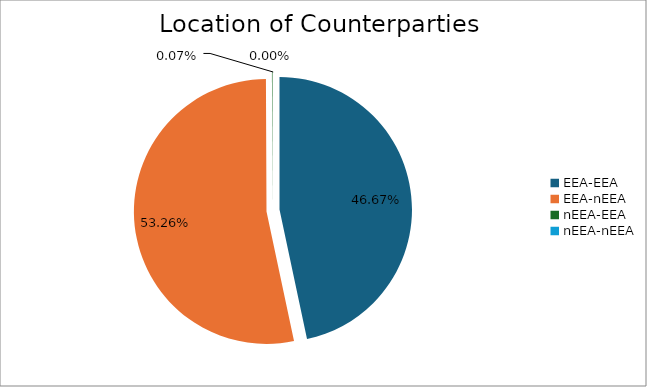
| Category | Series 0 |
|---|---|
| EEA-EEA | 6223949.172 |
| EEA-nEEA | 7102888.048 |
| nEEA-EEA | 8851.77 |
| nEEA-nEEA | 341.752 |